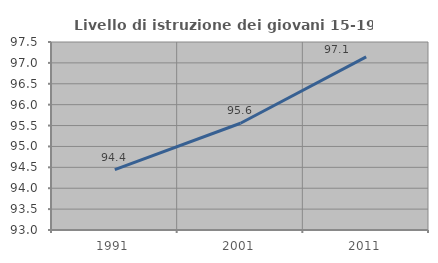
| Category | Livello di istruzione dei giovani 15-19 anni |
|---|---|
| 1991.0 | 94.444 |
| 2001.0 | 95.556 |
| 2011.0 | 97.143 |